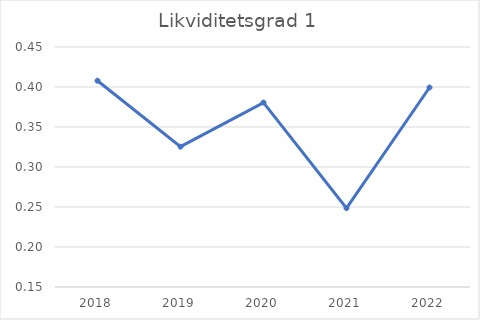
| Category | Likviditetsgrad 1 |
|---|---|
| 2018.0 | 0.408 |
| 2019.0 | 0.325 |
| 2020.0 | 0.381 |
| 2021.0 | 0.249 |
| 2022.0 | 0.399 |